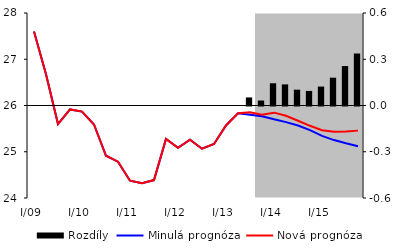
| Category | Rozdíly |
|---|---|
| 0 | 0 |
| 1 | 0 |
| 2 | 0 |
| 3 | 0 |
| 4 | 0 |
| 5 | 0 |
| 6 | 0 |
| 7 | 0 |
| 8 | 0 |
| 9 | 0 |
| 10 | 0 |
| 11 | 0 |
| 12 | 0 |
| 13 | 0 |
| 14 | 0 |
| 15 | 0 |
| 16 | 0 |
| 17 | 0 |
| 18 | 0.052 |
| 19 | 0.032 |
| 20 | 0.144 |
| 21 | 0.137 |
| 22 | 0.103 |
| 23 | 0.095 |
| 24 | 0.123 |
| 25 | 0.18 |
| 26 | 0.256 |
| 27 | 0.337 |